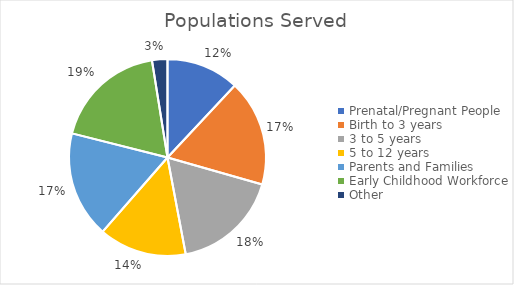
| Category | Count of activities |
|---|---|
| Prenatal/Pregnant People | 246 |
| Birth to 3 years | 359 |
| 3 to 5 years | 362 |
| 5 to 12 years | 296 |
| Parents and Families  | 360 |
| Early Childhood Workforce | 381 |
| Other | 52 |